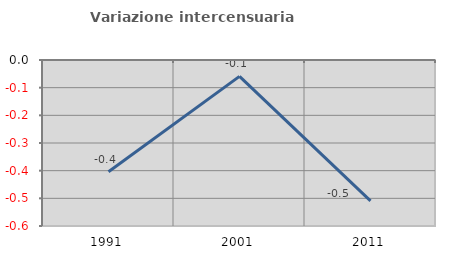
| Category | Variazione intercensuaria annua |
|---|---|
| 1991.0 | -0.404 |
| 2001.0 | -0.059 |
| 2011.0 | -0.509 |